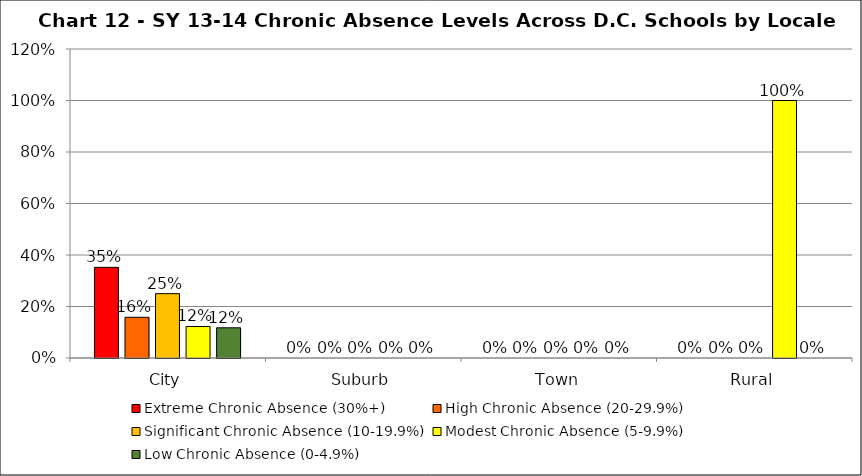
| Category | Extreme Chronic Absence (30%+) | High Chronic Absence (20-29.9%) | Significant Chronic Absence (10-19.9%) | Modest Chronic Absence (5-9.9%) | Low Chronic Absence (0-4.9%) |
|---|---|---|---|---|---|
| 0 | 0.352 | 0.158 | 0.25 | 0.122 | 0.117 |
| 1 | 0 | 0 | 0 | 0 | 0 |
| 2 | 0 | 0 | 0 | 0 | 0 |
| 3 | 0 | 0 | 0 | 1 | 0 |